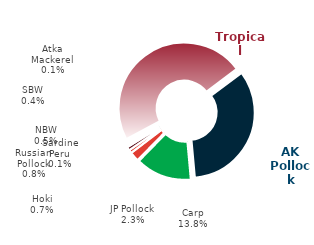
| Category | 2023 |
|---|---|
| Tropical | 106842.395 |
| AK Pollock | 75954 |
| Carp | 30947.655 |
| JP Pollock | 5143.514 |
| Pac Whiting | 0 |
| Hoki | 1678.2 |
| Russian Pollock | 1873.307 |
| SBW | 806.8 |
| NBW | 1080.035 |
| Atka Mackerel | 174.867 |
| Sardine Peru | 216 |